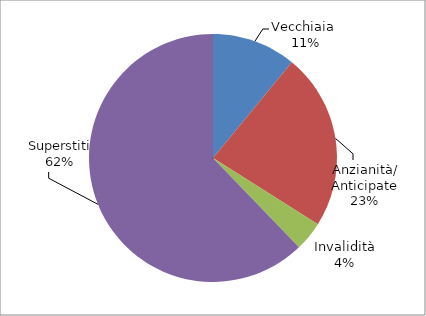
| Category | Series 0 |
|---|---|
| Vecchiaia  | 827 |
| Anzianità/ Anticipate | 1734 |
| Invalidità | 290 |
| Superstiti | 4690 |